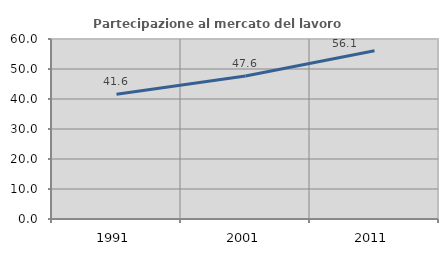
| Category | Partecipazione al mercato del lavoro  femminile |
|---|---|
| 1991.0 | 41.594 |
| 2001.0 | 47.645 |
| 2011.0 | 56.055 |